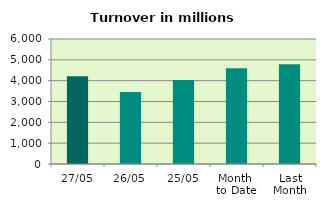
| Category | Series 0 |
|---|---|
| 27/05 | 4206.835 |
| 26/05 | 3461.657 |
| 25/05 | 4029.365 |
| Month 
to Date | 4591.617 |
| Last
Month | 4785.141 |